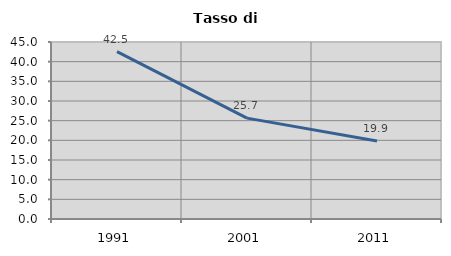
| Category | Tasso di disoccupazione   |
|---|---|
| 1991.0 | 42.545 |
| 2001.0 | 25.652 |
| 2011.0 | 19.856 |